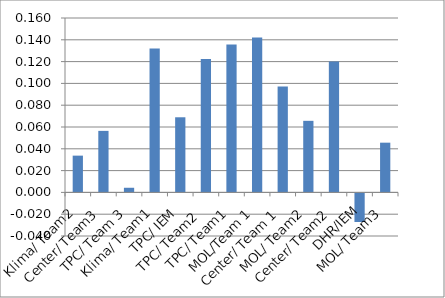
| Category | Series 0 |
|---|---|
| Klima/ Team2 | 0.034 |
| Center/ Team3 | 0.056 |
| TPC/ Team 3 | 0.004 |
| Klima/ Team1 | 0.132 |
| TPC/ IEM | 0.069 |
| TPC/ Team2  | 0.122 |
| TPC/ Team1 | 0.136 |
| MOL/Team 1 | 0.142 |
| Center/ Team 1 | 0.097 |
| MOL/ Team2 | 0.066 |
| Center/ Team2 | 0.12 |
| DHR/IEM | -0.027 |
| MOL/ Team3 | 0.046 |